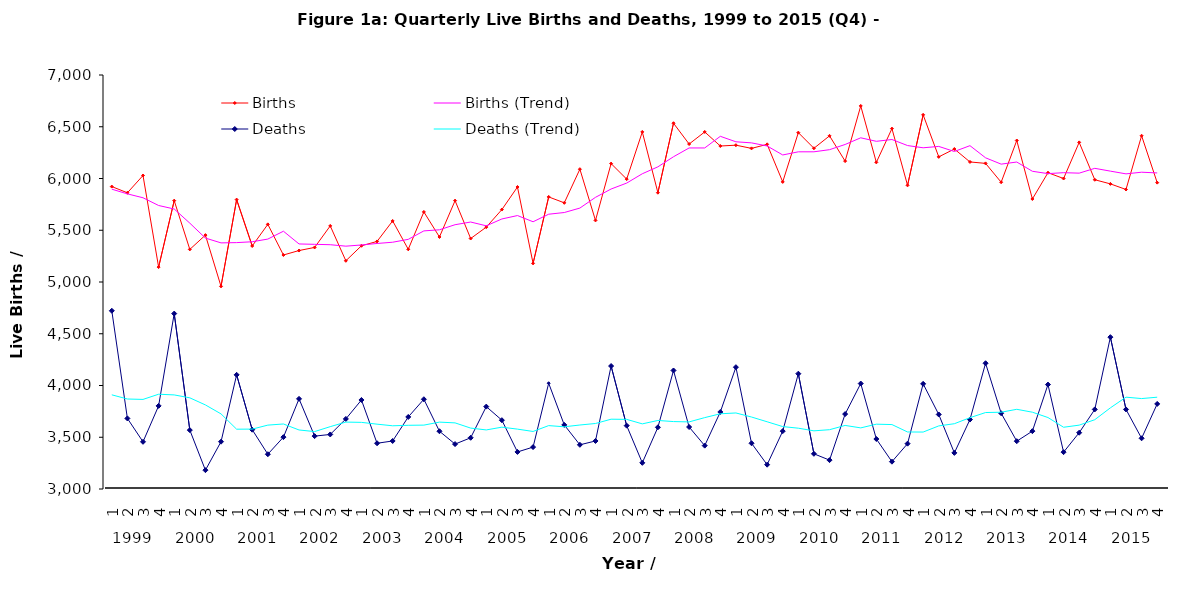
| Category | Births | Births (Trend) | Deaths | Deaths (Trend) |
|---|---|---|---|---|
| 0 | 5922 | 5896.75 | 4722 | 3910 |
| 1 | 5862 | 5851.5 | 3682 | 3869.5 |
| 2 | 6029 | 5814 | 3456 | 3865.5 |
| 3 | 5144 | 5739.25 | 3803 | 3915.75 |
| 4 | 5786 | 5705.25 | 4695 | 3909 |
| 5 | 5315 | 5568.5 | 3569 | 3880.75 |
| 6 | 5453 | 5424.5 | 3182 | 3812.25 |
| 7 | 4958 | 5378 | 3457 | 3725.75 |
| 8 | 5796 | 5380.5 | 4103 | 3577.75 |
| 9 | 5348 | 5388.75 | 3573 | 3578.75 |
| 10 | 5557 | 5414.75 | 3336 | 3617.25 |
| 11 | 5261 | 5490.5 | 3501 | 3628.25 |
| 12 | 5304 | 5367.5 | 3871 | 3570.25 |
| 13 | 5334 | 5364 | 3511 | 3554.75 |
| 14 | 5542 | 5360.25 | 3527 | 3602.5 |
| 15 | 5205 | 5346.25 | 3677 | 3646.5 |
| 16 | 5350 | 5357.75 | 3860 | 3643.75 |
| 17 | 5392 | 5372.25 | 3442 | 3626.5 |
| 18 | 5590 | 5384.25 | 3464 | 3610.75 |
| 19 | 5316 | 5412 | 3696 | 3615.5 |
| 20 | 5677 | 5493.75 | 3867 | 3617.25 |
| 21 | 5435 | 5504.5 | 3558 | 3646.25 |
| 22 | 5786 | 5553.5 | 3434 | 3638.75 |
| 23 | 5420 | 5579.5 | 3495 | 3588.5 |
| 24 | 5530 | 5542.75 | 3796 | 3570.75 |
| 25 | 5700 | 5609 | 3665 | 3597.5 |
| 26 | 5918 | 5642 | 3358 | 3578.5 |
| 27 | 5180 | 5582 | 3405 | 3556 |
| 28 | 5822 | 5655 | 4022 | 3612.5 |
| 29 | 5765 | 5671.25 | 3619 | 3601 |
| 30 | 6090 | 5714.25 | 3427 | 3618.25 |
| 31 | 5595 | 5818 | 3464 | 3633 |
| 32 | 6144 | 5898.5 | 4188 | 3674.5 |
| 33 | 5994 | 5955.75 | 3612 | 3672.75 |
| 34 | 6450 | 6045.75 | 3253 | 3629.25 |
| 35 | 5863 | 6112.75 | 3596 | 3662.25 |
| 36 | 6534 | 6210.25 | 4145 | 3651.5 |
| 37 | 6333 | 6295 | 3599 | 3648.25 |
| 38 | 6450 | 6295 | 3419 | 3689.75 |
| 39 | 6314 | 6407.75 | 3744 | 3726.75 |
| 40 | 6322 | 6354.75 | 4177 | 3734.75 |
| 41 | 6291 | 6344.25 | 3442 | 3695.5 |
| 42 | 6330 | 6314.25 | 3235 | 3649.5 |
| 43 | 5967 | 6227.5 | 3559 | 3603.25 |
| 44 | 6443 | 6257.75 | 4114 | 3587.5 |
| 45 | 6292 | 6258 | 3340 | 3562 |
| 46 | 6412 | 6278.5 | 3279 | 3573 |
| 47 | 6168 | 6328.75 | 3724 | 3614.25 |
| 48 | 6701 | 6393.25 | 4019 | 3590.5 |
| 49 | 6156 | 6359.25 | 3483 | 3626.25 |
| 50 | 6482 | 6376.75 | 3264 | 3622.5 |
| 51 | 5934 | 6318.25 | 3438 | 3551 |
| 52 | 6615 | 6296.75 | 4016 | 3550.25 |
| 53 | 6209 | 6310 | 3720 | 3609.5 |
| 54 | 6285 | 6260.75 | 3349 | 3630.75 |
| 55 | 6160 | 6317.25 | 3671 | 3689 |
| 56 | 6146 | 6200 | 4215 | 3738.75 |
| 57 | 5964 | 6138.75 | 3732 | 3741.75 |
| 58 | 6367 | 6159.25 | 3462 | 3770 |
| 59 | 5802 | 6069.75 | 3559 | 3742 |
| 60 | 6056 | 6047.25 | 4009 | 3690.5 |
| 61 | 6000 | 6056.25 | 3356 | 3596.5 |
| 62 | 6349 | 6051.75 | 3544 | 3617 |
| 63 | 5988 | 6098.25 | 3769 | 3669.5 |
| 64 | 5948 | 6071.25 | 4467 | 3784 |
| 65 | 5894 | 6044.75 | 3769 | 3887.25 |
| 66 | 6413 | 6060.75 | 3490 | 3873.75 |
| 67 | 5960 | 6053.75 | 3822 | 3887 |